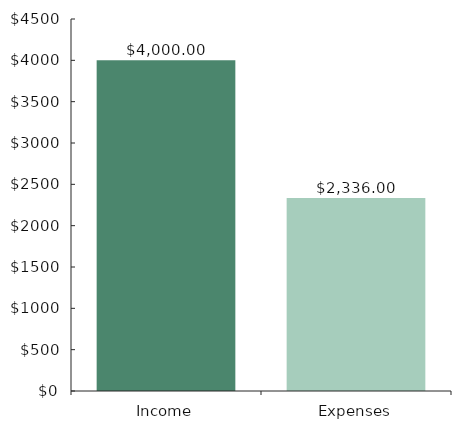
| Category | ChartData |
|---|---|
| 0 | 4000 |
| 1 | 2336 |